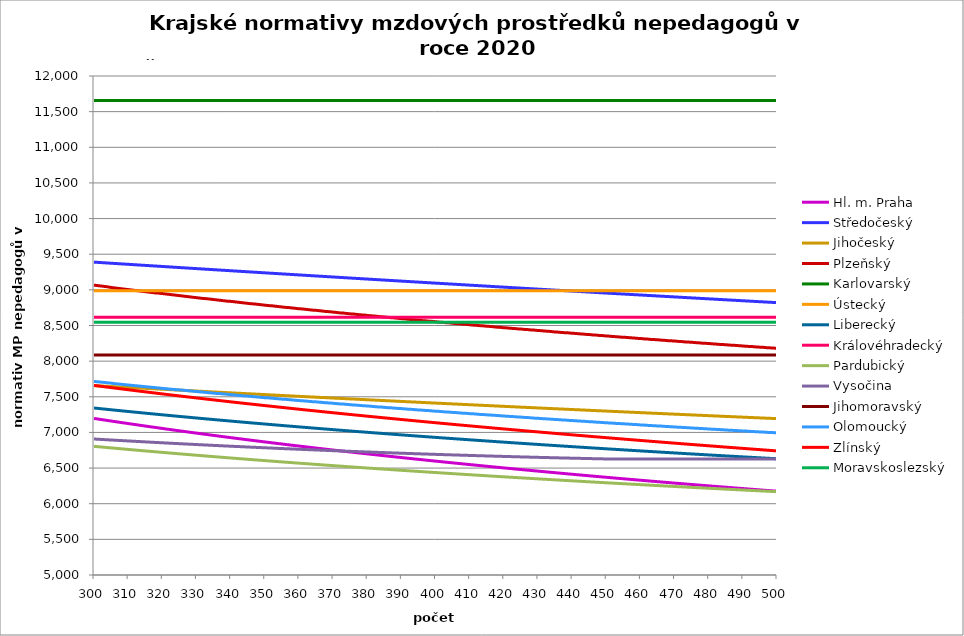
| Category | Hl. m. Praha | Středočeský | Jihočeský | Plzeňský | Karlovarský  | Ústecký   | Liberecký | Královéhradecký | Pardubický | Vysočina | Jihomoravský | Olomoucký | Zlínský | Moravskoslezský |
|---|---|---|---|---|---|---|---|---|---|---|---|---|---|---|
| 300.0 | 7196.467 | 9388.86 | 7657.202 | 9066.271 | 11657.998 | 8987.069 | 7342.544 | 8617.204 | 6804.909 | 6907.685 | 8087.211 | 7715.459 | 7659.58 | 8545.876 |
| 301.0 | 7189.126 | 9385.801 | 7654.599 | 9060.297 | 11657.998 | 8987.069 | 7337.594 | 8617.204 | 6800.501 | 6904.929 | 8087.211 | 7710.662 | 7653.41 | 8545.876 |
| 302.0 | 7181.82 | 9382.743 | 7651.998 | 9054.33 | 11657.998 | 8987.069 | 7332.664 | 8617.204 | 6796.111 | 6902.176 | 8087.211 | 7705.871 | 7647.263 | 8545.876 |
| 303.0 | 7174.548 | 9379.689 | 7649.401 | 9048.371 | 11657.998 | 8987.069 | 7327.755 | 8617.204 | 6791.74 | 6899.253 | 8087.211 | 7701.087 | 7641.14 | 8545.876 |
| 304.0 | 7167.311 | 9376.636 | 7646.807 | 9042.42 | 11657.998 | 8987.069 | 7322.867 | 8617.204 | 6787.386 | 6896.504 | 8087.211 | 7696.308 | 7635.04 | 8545.876 |
| 305.0 | 7160.107 | 9373.586 | 7644.217 | 9033.509 | 11657.998 | 8987.069 | 7317.999 | 8617.204 | 6783.051 | 6893.757 | 8087.211 | 7691.535 | 7628.963 | 8545.876 |
| 306.0 | 7152.937 | 9370.539 | 7641.629 | 9027.577 | 11657.998 | 8987.069 | 7313.152 | 8617.204 | 6778.734 | 6891.184 | 8087.211 | 7684.387 | 7622.908 | 8545.876 |
| 307.0 | 7145.801 | 9367.494 | 7639.044 | 9021.654 | 11657.998 | 8987.069 | 7308.326 | 8617.204 | 6774.435 | 6888.441 | 8087.211 | 7679.628 | 7616.876 | 8545.876 |
| 308.0 | 7138.698 | 9364.452 | 7636.463 | 9015.738 | 11657.998 | 8987.069 | 7303.519 | 8617.204 | 6770.154 | 6885.872 | 8087.211 | 7674.876 | 7610.867 | 8545.876 |
| 309.0 | 7131.627 | 9361.412 | 7633.885 | 9009.83 | 11657.998 | 8987.069 | 7298.732 | 8617.204 | 6765.89 | 6883.134 | 8087.211 | 7670.13 | 7604.88 | 8545.876 |
| 310.0 | 7124.589 | 9358.375 | 7631.309 | 9003.929 | 11657.998 | 8987.069 | 7293.965 | 8617.204 | 6761.643 | 6880.568 | 8087.211 | 7665.389 | 7598.916 | 8545.876 |
| 311.0 | 7117.584 | 9355.34 | 7628.737 | 8998.037 | 11657.998 | 8987.069 | 7289.218 | 8617.204 | 6757.414 | 6877.834 | 8087.211 | 7660.655 | 7592.973 | 8545.876 |
| 312.0 | 7110.61 | 9352.307 | 7626.168 | 8992.152 | 11657.998 | 8987.069 | 7284.49 | 8617.204 | 6753.202 | 6875.273 | 8087.211 | 7655.926 | 7587.052 | 8545.876 |
| 313.0 | 7103.669 | 9349.277 | 7623.602 | 8986.275 | 11657.998 | 8987.069 | 7279.781 | 8617.204 | 6749.007 | 6872.543 | 8087.211 | 7651.203 | 7581.152 | 8545.876 |
| 314.0 | 7096.758 | 9346.249 | 7621.039 | 8980.405 | 11657.998 | 8987.069 | 7275.092 | 8617.204 | 6744.828 | 6870.156 | 8087.211 | 7646.486 | 7575.274 | 8545.876 |
| 315.0 | 7089.879 | 9343.224 | 7618.48 | 8974.543 | 11657.998 | 8987.069 | 7270.422 | 8617.204 | 6740.667 | 6867.43 | 8087.211 | 7641.774 | 7569.418 | 8545.876 |
| 316.0 | 7083.031 | 9340.201 | 7615.923 | 8968.689 | 11657.998 | 8987.069 | 7265.77 | 8617.204 | 6736.522 | 6864.877 | 8087.211 | 7637.069 | 7563.582 | 8545.876 |
| 317.0 | 7076.214 | 9337.181 | 7613.369 | 8962.842 | 11657.998 | 8987.069 | 7261.138 | 8617.204 | 6732.394 | 6862.155 | 8087.211 | 7632.369 | 7557.768 | 8545.876 |
| 318.0 | 7069.427 | 9334.163 | 7610.819 | 8957.003 | 11657.998 | 8987.069 | 7256.524 | 8617.204 | 6728.282 | 6859.606 | 8087.211 | 7627.675 | 7551.975 | 8545.876 |
| 319.0 | 7062.671 | 9331.147 | 7608.271 | 8954.087 | 11657.998 | 8987.069 | 7251.928 | 8617.204 | 6724.186 | 6857.228 | 8087.211 | 7622.987 | 7546.202 | 8545.876 |
| 320.0 | 7055.944 | 9328.134 | 7605.727 | 8948.259 | 11657.998 | 8987.069 | 7247.351 | 8617.204 | 6720.107 | 6854.682 | 8087.211 | 7618.305 | 7540.45 | 8545.876 |
| 321.0 | 7049.247 | 9325.124 | 7603.185 | 8942.439 | 11657.998 | 8987.069 | 7242.792 | 8617.204 | 6716.043 | 6852.138 | 8087.211 | 7613.628 | 7534.718 | 8545.876 |
| 322.0 | 7042.58 | 9322.115 | 7600.647 | 8936.627 | 11657.998 | 8987.069 | 7238.251 | 8617.204 | 6711.996 | 6849.596 | 8087.211 | 7608.957 | 7529.006 | 8545.876 |
| 323.0 | 7035.942 | 9319.109 | 7598.112 | 8930.822 | 11657.998 | 8987.069 | 7233.728 | 8617.204 | 6707.964 | 6847.055 | 8087.211 | 7604.292 | 7523.315 | 8545.876 |
| 324.0 | 7029.333 | 9316.106 | 7595.58 | 8925.024 | 11657.998 | 8987.069 | 7229.223 | 8617.204 | 6703.948 | 6844.686 | 8087.211 | 7599.632 | 7517.644 | 8545.876 |
| 325.0 | 7022.753 | 9313.105 | 7593.05 | 8919.235 | 11657.998 | 8987.069 | 7224.736 | 8617.204 | 6699.947 | 6842.319 | 8087.211 | 7597.305 | 7511.992 | 8545.876 |
| 326.0 | 7016.201 | 9310.106 | 7590.524 | 8913.452 | 11657.998 | 8987.069 | 7220.266 | 8617.204 | 6695.962 | 6839.784 | 8087.211 | 7592.654 | 7506.36 | 8545.876 |
| 327.0 | 7009.678 | 9307.109 | 7588.001 | 8907.677 | 11657.998 | 8987.069 | 7215.813 | 8617.204 | 6691.993 | 6837.251 | 8087.211 | 7588.009 | 7500.748 | 8545.876 |
| 328.0 | 7003.183 | 9304.115 | 7585.481 | 8901.91 | 11657.998 | 8987.069 | 7211.378 | 8617.204 | 6688.038 | 6834.888 | 8087.211 | 7583.369 | 7495.155 | 8545.876 |
| 329.0 | 6996.716 | 9301.123 | 7582.964 | 8896.15 | 11657.998 | 8987.069 | 7206.96 | 8617.204 | 6684.099 | 6832.527 | 8087.211 | 7578.735 | 7489.582 | 8545.876 |
| 330.0 | 6990.277 | 9298.134 | 7580.45 | 8890.398 | 11657.998 | 8987.069 | 7202.559 | 8617.204 | 6680.174 | 6830 | 8087.211 | 7574.107 | 7484.027 | 8545.876 |
| 331.0 | 6983.865 | 9295.147 | 7577.939 | 8884.653 | 11657.998 | 8987.069 | 7198.175 | 8617.204 | 6676.265 | 6827.811 | 8087.211 | 7569.484 | 7478.492 | 8545.876 |
| 332.0 | 6977.48 | 9292.162 | 7575.431 | 8878.915 | 11657.998 | 8987.069 | 7193.807 | 8617.204 | 6672.37 | 6825.287 | 8087.211 | 7564.867 | 7472.976 | 8545.876 |
| 333.0 | 6971.123 | 9289.18 | 7572.926 | 8876.049 | 11657.998 | 8987.069 | 7189.457 | 8617.204 | 6668.49 | 6823.1 | 8087.211 | 7560.256 | 7467.478 | 8545.876 |
| 334.0 | 6964.792 | 9286.2 | 7570.424 | 8870.323 | 11657.998 | 8987.069 | 7185.123 | 8617.204 | 6664.625 | 6820.58 | 8087.211 | 7555.65 | 7461.999 | 8545.876 |
| 335.0 | 6958.488 | 9283.222 | 7567.925 | 8864.603 | 11657.998 | 8987.069 | 7180.805 | 8617.204 | 6660.774 | 6818.229 | 8087.211 | 7551.05 | 7456.539 | 8545.876 |
| 336.0 | 6952.211 | 9280.247 | 7565.429 | 8858.892 | 11657.998 | 8987.069 | 7176.504 | 8617.204 | 6656.937 | 6816.047 | 8087.211 | 7546.456 | 7451.097 | 8545.876 |
| 337.0 | 6945.959 | 9277.274 | 7562.935 | 8853.187 | 11657.998 | 8987.069 | 7172.219 | 8617.204 | 6653.115 | 6813.699 | 8087.211 | 7544.161 | 7445.673 | 8545.876 |
| 338.0 | 6939.734 | 9274.303 | 7560.445 | 8847.49 | 11657.998 | 8987.069 | 7167.95 | 8617.204 | 6649.307 | 6811.186 | 8087.211 | 7539.574 | 7440.267 | 8545.876 |
| 339.0 | 6933.535 | 9271.334 | 7557.958 | 8841.801 | 11657.998 | 8987.069 | 7163.697 | 8617.204 | 6645.513 | 6809.009 | 8087.211 | 7534.994 | 7434.88 | 8545.876 |
| 340.0 | 6927.361 | 9268.368 | 7555.474 | 8838.959 | 11657.998 | 8987.069 | 7159.459 | 8617.204 | 6641.733 | 6806.666 | 8087.211 | 7530.419 | 7429.51 | 8545.876 |
| 341.0 | 6921.213 | 9265.404 | 7552.993 | 8833.28 | 11657.998 | 8987.069 | 7155.238 | 8617.204 | 6637.967 | 6804.492 | 8087.211 | 7525.85 | 7424.158 | 8545.876 |
| 342.0 | 6915.09 | 9262.443 | 7550.515 | 8827.608 | 11657.998 | 8987.069 | 7151.032 | 8617.204 | 6634.214 | 6802.152 | 8087.211 | 7521.286 | 7418.824 | 8545.876 |
| 343.0 | 6908.992 | 9259.483 | 7548.039 | 8821.944 | 11657.998 | 8987.069 | 7146.842 | 8617.204 | 6630.476 | 6800.147 | 8087.211 | 7516.727 | 7413.507 | 8545.876 |
| 344.0 | 6902.919 | 9256.526 | 7545.567 | 8816.287 | 11657.998 | 8987.069 | 7142.667 | 8617.204 | 6626.751 | 6797.81 | 8087.211 | 7512.174 | 7408.208 | 8545.876 |
| 345.0 | 6896.871 | 9253.572 | 7543.098 | 8810.638 | 11657.998 | 8987.069 | 7138.508 | 8617.204 | 6623.039 | 6795.642 | 8087.211 | 7509.9 | 7402.926 | 8545.876 |
| 346.0 | 6890.847 | 9250.619 | 7540.631 | 8804.995 | 11657.998 | 8987.069 | 7134.364 | 8617.204 | 6619.341 | 6793.308 | 8087.211 | 7505.356 | 7397.661 | 8545.876 |
| 347.0 | 6884.847 | 9247.669 | 7538.168 | 8802.177 | 11657.998 | 8987.069 | 7130.234 | 8617.204 | 6615.656 | 6791.309 | 8087.211 | 7500.816 | 7392.413 | 8545.876 |
| 348.0 | 6878.872 | 9244.721 | 7535.707 | 8796.545 | 11657.998 | 8987.069 | 7126.12 | 8617.204 | 6611.985 | 6788.978 | 8087.211 | 7496.283 | 7387.182 | 8545.876 |
| 349.0 | 6872.921 | 9241.775 | 7533.25 | 8790.921 | 11657.998 | 8987.069 | 7122.021 | 8617.204 | 6608.326 | 6786.982 | 8087.211 | 7491.755 | 7381.968 | 8545.876 |
| 350.0 | 6866.994 | 9238.832 | 7530.795 | 8785.304 | 11657.998 | 8987.069 | 7117.937 | 8617.204 | 6604.681 | 6784.654 | 8087.211 | 7487.232 | 7376.771 | 8545.876 |
| 351.0 | 6861.09 | 9235.89 | 7528.343 | 8779.693 | 11657.998 | 8987.069 | 7113.867 | 8617.204 | 6601.049 | 6782.66 | 8087.211 | 7484.973 | 7371.591 | 8545.876 |
| 352.0 | 6855.209 | 9232.951 | 7525.895 | 8776.891 | 11657.998 | 8987.069 | 7109.812 | 8617.204 | 6597.429 | 6780.501 | 8087.211 | 7480.458 | 7366.427 | 8545.876 |
| 353.0 | 6849.352 | 9230.015 | 7523.449 | 8771.292 | 11657.998 | 8987.069 | 7105.771 | 8617.204 | 6593.822 | 6778.343 | 8087.211 | 7475.949 | 7361.279 | 8545.876 |
| 354.0 | 6843.519 | 9227.08 | 7521.006 | 8765.7 | 11657.998 | 8987.069 | 7101.745 | 8617.204 | 6590.228 | 6776.187 | 8087.211 | 7471.446 | 7356.148 | 8545.876 |
| 355.0 | 6837.708 | 9224.148 | 7518.566 | 8760.115 | 11657.998 | 8987.069 | 7097.733 | 8617.204 | 6586.647 | 6774.198 | 8087.211 | 7466.948 | 7351.033 | 8545.876 |
| 356.0 | 6831.92 | 9221.218 | 7516.128 | 8754.537 | 11657.998 | 8987.069 | 7093.736 | 8617.204 | 6583.078 | 6772.045 | 8087.211 | 7464.701 | 7345.934 | 8545.876 |
| 357.0 | 6826.154 | 9218.29 | 7513.694 | 8751.75 | 11657.998 | 8987.069 | 7089.752 | 8617.204 | 6579.522 | 6770.058 | 8087.211 | 7460.211 | 7340.851 | 8545.876 |
| 358.0 | 6820.411 | 9215.364 | 7511.263 | 8746.183 | 11657.998 | 8987.069 | 7085.783 | 8617.204 | 6575.978 | 6768.073 | 8087.211 | 7455.726 | 7335.784 | 8545.876 |
| 359.0 | 6814.69 | 9212.441 | 7508.834 | 8740.623 | 11657.998 | 8987.069 | 7081.827 | 8617.204 | 6572.446 | 6765.923 | 8087.211 | 7451.247 | 7330.733 | 8545.876 |
| 360.0 | 6808.992 | 9209.52 | 7506.409 | 8735.07 | 11657.998 | 8987.069 | 7077.886 | 8617.204 | 6568.926 | 6763.94 | 8087.211 | 7446.773 | 7325.698 | 8545.876 |
| 361.0 | 6803.315 | 9206.601 | 7503.986 | 8732.296 | 11657.998 | 8987.069 | 7073.958 | 8617.204 | 6565.419 | 6761.793 | 8087.211 | 7444.538 | 7320.678 | 8545.876 |
| 362.0 | 6797.661 | 9203.684 | 7501.566 | 8726.753 | 11657.998 | 8987.069 | 7070.044 | 8617.204 | 6561.924 | 6759.813 | 8087.211 | 7440.072 | 7315.674 | 8545.876 |
| 363.0 | 6792.028 | 9200.769 | 7499.149 | 8721.218 | 11657.998 | 8987.069 | 7066.143 | 8617.204 | 6558.44 | 6757.998 | 8087.211 | 7435.612 | 7310.685 | 8545.876 |
| 364.0 | 6786.416 | 9197.857 | 7496.735 | 8715.689 | 11657.998 | 8987.069 | 7062.256 | 8617.204 | 6554.969 | 6755.855 | 8087.211 | 7431.156 | 7305.711 | 8545.876 |
| 365.0 | 6780.826 | 9194.947 | 7494.324 | 8712.928 | 11657.998 | 8987.069 | 7058.382 | 8617.204 | 6551.509 | 6753.878 | 8087.211 | 7428.931 | 7300.753 | 8545.876 |
| 366.0 | 6775.258 | 9192.039 | 7491.916 | 8707.41 | 11657.998 | 8987.069 | 7054.521 | 8617.204 | 6548.062 | 6751.902 | 8087.211 | 7424.484 | 7295.81 | 8545.876 |
| 367.0 | 6769.71 | 9189.133 | 7489.51 | 8701.899 | 11657.998 | 8987.069 | 7050.674 | 8617.204 | 6544.625 | 6749.927 | 8087.211 | 7420.042 | 7290.882 | 8545.876 |
| 368.0 | 6764.183 | 9186.229 | 7487.108 | 8696.395 | 11657.998 | 8987.069 | 7046.84 | 8617.204 | 6541.201 | 6748.118 | 8087.211 | 7415.605 | 7285.969 | 8545.876 |
| 369.0 | 6758.677 | 9183.328 | 7484.708 | 8693.645 | 11657.998 | 8987.069 | 7043.019 | 8617.204 | 6537.788 | 6746.145 | 8087.211 | 7413.389 | 7281.07 | 8545.876 |
| 370.0 | 6753.192 | 9180.428 | 7482.311 | 8688.152 | 11657.998 | 8987.069 | 7039.211 | 8617.204 | 6534.386 | 6744.174 | 8087.211 | 7408.961 | 7276.187 | 8545.876 |
| 371.0 | 6747.727 | 9177.531 | 7479.917 | 8682.665 | 11657.998 | 8987.069 | 7035.416 | 8617.204 | 6530.996 | 6742.367 | 8087.211 | 7404.537 | 7271.318 | 8545.876 |
| 372.0 | 6742.283 | 9174.636 | 7477.526 | 8677.185 | 11657.998 | 8987.069 | 7031.633 | 8617.204 | 6527.617 | 6740.398 | 8087.211 | 7400.119 | 7266.463 | 8545.876 |
| 373.0 | 6736.859 | 9171.743 | 7475.137 | 8674.448 | 11657.998 | 8987.069 | 7027.864 | 8617.204 | 6524.249 | 6738.594 | 8087.211 | 7397.912 | 7261.623 | 8545.876 |
| 374.0 | 6731.455 | 9168.852 | 7472.752 | 8668.979 | 11657.998 | 8987.069 | 7024.107 | 8617.204 | 6520.893 | 6736.791 | 8087.211 | 7393.502 | 7256.798 | 8545.876 |
| 375.0 | 6726.071 | 9165.963 | 7470.369 | 8663.516 | 11657.998 | 8987.069 | 7020.362 | 8617.204 | 6517.547 | 6734.825 | 8087.211 | 7389.097 | 7251.987 | 8545.876 |
| 376.0 | 6720.706 | 9163.077 | 7467.989 | 8660.787 | 11657.998 | 8987.069 | 7016.63 | 8617.204 | 6514.213 | 6733.024 | 8087.211 | 7384.698 | 7247.19 | 8545.876 |
| 377.0 | 6715.362 | 9160.193 | 7465.612 | 8655.335 | 11657.998 | 8987.069 | 7012.911 | 8617.204 | 6510.889 | 6731.224 | 8087.211 | 7382.5 | 7242.407 | 8545.876 |
| 378.0 | 6710.037 | 9157.31 | 7463.238 | 8649.89 | 11657.998 | 8987.069 | 7009.203 | 8617.204 | 6507.577 | 6729.424 | 8087.211 | 7378.108 | 7237.638 | 8545.876 |
| 379.0 | 6704.731 | 9154.43 | 7460.866 | 8647.17 | 11657.998 | 8987.069 | 7005.508 | 8617.204 | 6504.275 | 6727.463 | 8087.211 | 7373.722 | 7232.884 | 8545.876 |
| 380.0 | 6699.445 | 9151.552 | 7458.498 | 8641.735 | 11657.998 | 8987.069 | 7001.826 | 8617.204 | 6500.984 | 6725.829 | 8087.211 | 7371.53 | 7228.143 | 8545.876 |
| 381.0 | 6694.178 | 9148.676 | 7456.132 | 8636.307 | 11657.998 | 8987.069 | 6998.155 | 8617.204 | 6497.704 | 6724.032 | 8087.211 | 7367.152 | 7223.416 | 8545.876 |
| 382.0 | 6688.93 | 9145.803 | 7453.769 | 8633.595 | 11657.998 | 8987.069 | 6994.496 | 8617.204 | 6494.434 | 6722.074 | 8087.211 | 7362.778 | 7218.703 | 8545.876 |
| 383.0 | 6683.701 | 9142.931 | 7451.409 | 8628.177 | 11657.998 | 8987.069 | 6990.85 | 8617.204 | 6491.175 | 6720.443 | 8087.211 | 7358.41 | 7214.003 | 8545.876 |
| 384.0 | 6678.49 | 9140.062 | 7449.051 | 8622.766 | 11657.998 | 8987.069 | 6987.215 | 8617.204 | 6487.926 | 6718.649 | 8087.211 | 7356.228 | 7209.317 | 8545.876 |
| 385.0 | 6673.299 | 9137.194 | 7446.697 | 8620.063 | 11657.998 | 8987.069 | 6983.592 | 8617.204 | 6484.688 | 6717.02 | 8087.211 | 7351.867 | 7204.644 | 8545.876 |
| 386.0 | 6668.126 | 9134.329 | 7444.345 | 8614.662 | 11657.998 | 8987.069 | 6979.98 | 8617.204 | 6481.46 | 6715.391 | 8087.211 | 7347.512 | 7199.985 | 8545.876 |
| 387.0 | 6662.971 | 9131.466 | 7441.996 | 8609.267 | 11657.998 | 8987.069 | 6976.381 | 8617.204 | 6478.242 | 6713.437 | 8087.211 | 7345.336 | 7195.339 | 8545.876 |
| 388.0 | 6657.835 | 9128.604 | 7439.649 | 8606.573 | 11657.998 | 8987.069 | 6972.793 | 8617.204 | 6475.035 | 6711.81 | 8087.211 | 7340.988 | 7190.707 | 8545.876 |
| 389.0 | 6652.717 | 9125.745 | 7437.306 | 8601.189 | 11657.998 | 8987.069 | 6969.216 | 8617.204 | 6471.838 | 6710.184 | 8087.211 | 7336.646 | 7186.087 | 8545.876 |
| 390.0 | 6647.616 | 9122.888 | 7434.965 | 8595.811 | 11657.998 | 8987.069 | 6965.651 | 8617.204 | 6468.651 | 6708.558 | 8087.211 | 7334.477 | 7181.481 | 8545.876 |
| 391.0 | 6642.534 | 9120.033 | 7432.627 | 8593.125 | 11657.998 | 8987.069 | 6962.097 | 8617.204 | 6465.474 | 6706.934 | 8087.211 | 7330.142 | 7176.888 | 8545.876 |
| 392.0 | 6637.47 | 9117.181 | 7430.292 | 8587.758 | 11657.998 | 8987.069 | 6958.555 | 8617.204 | 6462.307 | 6705.147 | 8087.211 | 7325.812 | 7172.307 | 8545.876 |
| 393.0 | 6632.423 | 9114.33 | 7427.959 | 8582.397 | 11657.998 | 8987.069 | 6955.024 | 8617.204 | 6459.15 | 6703.524 | 8087.211 | 7323.649 | 7167.74 | 8545.876 |
| 394.0 | 6627.394 | 9111.481 | 7425.63 | 8579.719 | 11657.998 | 8987.069 | 6951.504 | 8617.204 | 6456.002 | 6701.902 | 8087.211 | 7319.327 | 7163.185 | 8545.876 |
| 395.0 | 6622.383 | 9108.635 | 7423.303 | 8574.369 | 11657.998 | 8987.069 | 6947.995 | 8617.204 | 6452.865 | 6700.281 | 8087.211 | 7315.01 | 7158.643 | 8545.876 |
| 396.0 | 6617.389 | 9105.79 | 7420.978 | 8569.025 | 11657.998 | 8987.069 | 6944.497 | 8617.204 | 6449.737 | 6698.66 | 8087.211 | 7312.854 | 7154.114 | 8545.876 |
| 397.0 | 6612.412 | 9102.948 | 7418.657 | 8566.355 | 11657.998 | 8987.069 | 6941.01 | 8617.204 | 6446.619 | 6697.04 | 8087.211 | 7308.544 | 7149.597 | 8545.876 |
| 398.0 | 6607.452 | 9100.107 | 7416.338 | 8561.021 | 11657.998 | 8987.069 | 6937.534 | 8617.204 | 6443.511 | 6695.583 | 8087.211 | 7306.392 | 7145.093 | 8545.876 |
| 399.0 | 6602.51 | 9097.269 | 7414.022 | 8558.357 | 11657.998 | 8987.069 | 6934.069 | 8617.204 | 6440.412 | 6693.803 | 8087.211 | 7302.09 | 7140.601 | 8545.876 |
| 400.0 | 6597.584 | 9094.432 | 7411.709 | 8553.033 | 11657.998 | 8987.069 | 6930.615 | 8617.204 | 6437.323 | 6692.185 | 8087.211 | 7297.793 | 7136.122 | 8545.876 |
| 401.0 | 6592.675 | 9091.598 | 7409.398 | 8547.715 | 11657.998 | 8987.069 | 6927.171 | 8617.204 | 6434.243 | 6690.73 | 8087.211 | 7295.647 | 7131.655 | 8545.876 |
| 402.0 | 6587.783 | 9088.766 | 7407.091 | 8545.059 | 11657.998 | 8987.069 | 6923.738 | 8617.204 | 6431.173 | 6689.114 | 8087.211 | 7291.358 | 7127.2 | 8545.876 |
| 403.0 | 6582.907 | 9085.936 | 7404.786 | 8539.752 | 11657.998 | 8987.069 | 6920.316 | 8617.204 | 6428.112 | 6687.66 | 8087.211 | 7287.074 | 7122.758 | 8545.876 |
| 404.0 | 6578.048 | 9083.107 | 7402.483 | 8537.1 | 11657.998 | 8987.069 | 6916.904 | 8617.204 | 6425.06 | 6686.207 | 8087.211 | 7284.934 | 7118.327 | 8545.876 |
| 405.0 | 6573.206 | 9080.281 | 7400.184 | 8531.803 | 11657.998 | 8987.069 | 6913.503 | 8617.204 | 6422.018 | 6684.593 | 8087.211 | 7280.657 | 7113.908 | 8545.876 |
| 406.0 | 6568.38 | 9077.457 | 7397.887 | 8526.512 | 11657.998 | 8987.069 | 6910.112 | 8617.204 | 6418.985 | 6683.141 | 8087.211 | 7278.521 | 7109.502 | 8545.876 |
| 407.0 | 6563.57 | 9074.635 | 7395.592 | 8523.869 | 11657.998 | 8987.069 | 6906.731 | 8617.204 | 6415.961 | 6681.69 | 8087.211 | 7274.252 | 7105.107 | 8545.876 |
| 408.0 | 6558.776 | 9071.815 | 7393.301 | 8518.587 | 11657.998 | 8987.069 | 6903.361 | 8617.204 | 6412.946 | 6680.239 | 8087.211 | 7269.988 | 7100.724 | 8545.876 |
| 409.0 | 6553.998 | 9068.997 | 7391.012 | 8515.949 | 11657.998 | 8987.069 | 6900.001 | 8617.204 | 6409.94 | 6678.789 | 8087.211 | 7267.858 | 7096.353 | 8545.876 |
| 410.0 | 6549.236 | 9066.181 | 7388.726 | 8510.678 | 11657.998 | 8987.069 | 6896.651 | 8617.204 | 6406.943 | 6677.34 | 8087.211 | 7263.602 | 7091.994 | 8545.876 |
| 411.0 | 6544.49 | 9063.367 | 7386.442 | 8505.413 | 11657.998 | 8987.069 | 6893.311 | 8617.204 | 6403.955 | 6675.891 | 8087.211 | 7261.475 | 7087.646 | 8545.876 |
| 412.0 | 6539.759 | 9060.555 | 7384.162 | 8502.783 | 11657.998 | 8987.069 | 6889.982 | 8617.204 | 6400.976 | 6674.443 | 8087.211 | 7257.226 | 7083.31 | 8545.876 |
| 413.0 | 6535.045 | 9057.745 | 7381.884 | 8497.528 | 11657.998 | 8987.069 | 6886.662 | 8617.204 | 6398.005 | 6672.835 | 8087.211 | 7252.982 | 7078.985 | 8545.876 |
| 414.0 | 6530.345 | 9054.937 | 7379.608 | 8494.903 | 11657.998 | 8987.069 | 6883.352 | 8617.204 | 6395.044 | 6671.71 | 8087.211 | 7250.862 | 7074.672 | 8545.876 |
| 415.0 | 6525.661 | 9052.131 | 7377.335 | 8489.657 | 11657.998 | 8987.069 | 6880.052 | 8617.204 | 6392.091 | 6670.264 | 8087.211 | 7246.626 | 7070.37 | 8545.876 |
| 416.0 | 6520.993 | 9049.327 | 7375.065 | 8487.037 | 11657.998 | 8987.069 | 6876.762 | 8617.204 | 6389.147 | 6668.657 | 8087.211 | 7244.509 | 7066.08 | 8545.876 |
| 417.0 | 6516.34 | 9046.525 | 7372.798 | 8481.801 | 11657.998 | 8987.069 | 6873.482 | 8617.204 | 6386.212 | 6667.533 | 8087.211 | 7240.28 | 7061.801 | 8545.876 |
| 418.0 | 6511.702 | 9043.724 | 7370.533 | 8476.572 | 11657.998 | 8987.069 | 6870.211 | 8617.204 | 6383.285 | 6666.089 | 8087.211 | 7238.167 | 7057.533 | 8545.876 |
| 419.0 | 6507.079 | 9040.926 | 7368.271 | 8473.96 | 11657.998 | 8987.069 | 6866.95 | 8617.204 | 6380.367 | 6664.806 | 8087.211 | 7233.946 | 7053.276 | 8545.876 |
| 420.0 | 6502.47 | 9038.13 | 7366.012 | 8468.74 | 11657.998 | 8987.069 | 6863.699 | 8617.204 | 6377.457 | 6663.362 | 8087.211 | 7229.729 | 7049.03 | 8545.876 |
| 421.0 | 6497.877 | 9035.336 | 7363.755 | 8466.133 | 11657.998 | 8987.069 | 6860.457 | 8617.204 | 6374.556 | 6662.08 | 8087.211 | 7227.622 | 7044.795 | 8545.876 |
| 422.0 | 6493.299 | 9032.544 | 7361.501 | 8460.923 | 11657.998 | 8987.069 | 6857.225 | 8617.204 | 6371.663 | 6660.798 | 8087.211 | 7223.413 | 7040.572 | 8545.876 |
| 423.0 | 6488.735 | 9029.754 | 7359.25 | 8458.321 | 11657.998 | 8987.069 | 6854.002 | 8617.204 | 6368.778 | 6659.357 | 8087.211 | 7221.31 | 7036.359 | 8545.876 |
| 424.0 | 6484.186 | 9026.965 | 7357.001 | 8453.12 | 11657.998 | 8987.069 | 6850.788 | 8617.204 | 6365.902 | 6658.076 | 8087.211 | 7217.108 | 7032.157 | 8545.876 |
| 425.0 | 6479.652 | 9024.179 | 7354.755 | 8450.522 | 11657.998 | 8987.069 | 6847.584 | 8617.204 | 6363.034 | 6656.795 | 8087.211 | 7215.009 | 7027.966 | 8545.876 |
| 426.0 | 6475.132 | 9021.395 | 7352.511 | 8445.332 | 11657.998 | 8987.069 | 6844.389 | 8617.204 | 6360.174 | 6655.516 | 8087.211 | 7210.814 | 7023.785 | 8545.876 |
| 427.0 | 6470.626 | 9018.613 | 7350.27 | 8442.739 | 11657.998 | 8987.069 | 6841.204 | 8617.204 | 6357.322 | 6654.236 | 8087.211 | 7208.718 | 7019.615 | 8545.876 |
| 428.0 | 6466.135 | 9015.832 | 7348.032 | 8437.558 | 11657.998 | 8987.069 | 6838.027 | 8617.204 | 6354.479 | 6652.957 | 8087.211 | 7204.531 | 7015.456 | 8545.876 |
| 429.0 | 6461.657 | 9013.054 | 7345.796 | 8434.969 | 11657.998 | 8987.069 | 6834.86 | 8617.204 | 6351.643 | 6651.679 | 8087.211 | 7200.348 | 7011.307 | 8545.876 |
| 430.0 | 6457.194 | 9010.277 | 7343.563 | 8429.798 | 11657.998 | 8987.069 | 6831.702 | 8617.204 | 6348.816 | 6650.401 | 8087.211 | 7198.259 | 7007.169 | 8545.876 |
| 431.0 | 6452.745 | 9007.503 | 7341.333 | 8427.214 | 11657.998 | 8987.069 | 6828.553 | 8617.204 | 6345.997 | 6649.124 | 8087.211 | 7194.084 | 7003.042 | 8545.876 |
| 432.0 | 6448.31 | 9004.73 | 7339.105 | 8422.052 | 11657.998 | 8987.069 | 6825.413 | 8617.204 | 6343.185 | 6648.166 | 8087.211 | 7191.998 | 6998.925 | 8545.876 |
| 433.0 | 6443.889 | 9001.959 | 7336.88 | 8419.473 | 11657.998 | 8987.069 | 6822.281 | 8617.204 | 6340.382 | 6646.889 | 8087.211 | 7187.83 | 6994.818 | 8545.876 |
| 434.0 | 6439.481 | 8999.191 | 7334.658 | 8414.321 | 11657.998 | 8987.069 | 6819.159 | 8617.204 | 6337.586 | 6645.613 | 8087.211 | 7185.747 | 6990.721 | 8545.876 |
| 435.0 | 6435.088 | 8996.424 | 7332.438 | 8409.174 | 11657.998 | 8987.069 | 6816.046 | 8617.204 | 6334.798 | 6644.497 | 8087.211 | 7181.587 | 6986.635 | 8545.876 |
| 436.0 | 6430.708 | 8993.659 | 7330.22 | 8406.603 | 11657.998 | 8987.069 | 6812.941 | 8617.204 | 6332.018 | 6643.222 | 8087.211 | 7179.508 | 6982.559 | 8545.876 |
| 437.0 | 6426.341 | 8990.896 | 7328.006 | 8401.467 | 11657.998 | 8987.069 | 6809.845 | 8617.204 | 6329.246 | 6642.107 | 8087.211 | 7175.354 | 6978.493 | 8545.876 |
| 438.0 | 6421.988 | 8988.135 | 7325.793 | 8398.9 | 11657.998 | 8987.069 | 6806.758 | 8617.204 | 6326.481 | 6641.151 | 8087.211 | 7173.279 | 6974.437 | 8545.876 |
| 439.0 | 6417.648 | 8985.376 | 7323.584 | 8396.336 | 11657.998 | 8987.069 | 6803.679 | 8617.204 | 6323.724 | 6639.877 | 8087.211 | 7169.133 | 6970.391 | 8545.876 |
| 440.0 | 6413.322 | 8982.619 | 7321.377 | 8391.211 | 11657.998 | 8987.069 | 6800.609 | 8617.204 | 6320.975 | 6638.763 | 8087.211 | 7167.062 | 6966.355 | 8545.876 |
| 441.0 | 6409.009 | 8979.863 | 7319.173 | 8388.652 | 11657.998 | 8987.069 | 6797.548 | 8617.204 | 6318.233 | 6637.649 | 8087.211 | 7162.922 | 6962.329 | 8545.876 |
| 442.0 | 6404.709 | 8977.11 | 7316.971 | 8383.537 | 11657.998 | 8987.069 | 6794.495 | 8617.204 | 6315.499 | 6636.536 | 8087.211 | 7160.855 | 6958.313 | 8545.876 |
| 443.0 | 6400.422 | 8974.359 | 7314.772 | 8380.981 | 11657.998 | 8987.069 | 6791.451 | 8617.204 | 6312.772 | 6635.582 | 8087.211 | 7156.722 | 6954.307 | 8545.876 |
| 444.0 | 6396.148 | 8971.609 | 7312.575 | 8375.876 | 11657.998 | 8987.069 | 6788.415 | 8617.204 | 6310.053 | 6634.469 | 8087.211 | 7154.658 | 6950.311 | 8545.876 |
| 445.0 | 6391.887 | 8968.861 | 7310.381 | 8373.325 | 11657.998 | 8987.069 | 6785.387 | 8617.204 | 6307.341 | 6633.356 | 8087.211 | 7150.533 | 6946.324 | 8545.876 |
| 446.0 | 6387.639 | 8966.116 | 7308.189 | 8368.229 | 11657.998 | 8987.069 | 6782.368 | 8617.204 | 6304.637 | 6632.244 | 8087.211 | 7148.473 | 6942.347 | 8545.876 |
| 447.0 | 6383.404 | 8963.372 | 7306 | 8365.683 | 11657.998 | 8987.069 | 6779.357 | 8617.204 | 6301.94 | 6631.133 | 8087.211 | 7144.355 | 6938.38 | 8545.876 |
| 448.0 | 6379.181 | 8960.63 | 7303.814 | 8360.596 | 11657.998 | 8987.069 | 6776.354 | 8617.204 | 6299.25 | 6630.18 | 8087.211 | 7142.298 | 6934.422 | 8545.876 |
| 449.0 | 6374.971 | 8957.89 | 7301.63 | 8358.055 | 11657.998 | 8987.069 | 6773.359 | 8617.204 | 6296.567 | 6629.069 | 8087.211 | 7138.187 | 6930.474 | 8545.876 |
| 450.0 | 6370.774 | 8955.151 | 7299.449 | 8352.977 | 11657.998 | 8987.069 | 6770.373 | 8617.204 | 6293.892 | 6628.117 | 8087.211 | 7136.133 | 6926.535 | 8545.876 |
| 451.0 | 6366.589 | 8952.415 | 7297.27 | 8350.44 | 11657.998 | 8987.069 | 6767.395 | 8617.204 | 6291.224 | 6628.117 | 8087.211 | 7132.03 | 6922.606 | 8545.876 |
| 452.0 | 6362.417 | 8949.681 | 7295.094 | 8345.372 | 11657.998 | 8987.069 | 6764.425 | 8617.204 | 6288.563 | 6628.117 | 8087.211 | 7129.98 | 6918.686 | 8545.876 |
| 453.0 | 6358.257 | 8946.948 | 7292.92 | 8342.84 | 11657.998 | 8987.069 | 6761.462 | 8617.204 | 6285.909 | 6628.117 | 8087.211 | 7125.883 | 6914.775 | 8545.876 |
| 454.0 | 6354.11 | 8944.218 | 7290.749 | 8337.78 | 11657.998 | 8987.069 | 6758.508 | 8617.204 | 6283.262 | 6628.117 | 8087.211 | 7123.837 | 6910.874 | 8545.876 |
| 455.0 | 6349.974 | 8941.489 | 7288.581 | 8335.253 | 11657.998 | 8987.069 | 6755.562 | 8617.204 | 6280.622 | 6628.117 | 8087.211 | 7121.792 | 6906.982 | 8545.876 |
| 456.0 | 6345.851 | 8938.762 | 7286.415 | 8332.727 | 11657.998 | 8987.069 | 6752.624 | 8617.204 | 6277.99 | 6628.117 | 8087.211 | 7117.704 | 6903.1 | 8545.876 |
| 457.0 | 6341.74 | 8936.037 | 7284.251 | 8327.68 | 11657.998 | 8987.069 | 6749.693 | 8617.204 | 6275.364 | 6628.117 | 8087.211 | 7115.663 | 6899.226 | 8545.876 |
| 458.0 | 6337.641 | 8933.314 | 7282.09 | 8325.159 | 11657.998 | 8987.069 | 6746.771 | 8617.204 | 6272.745 | 6628.117 | 8087.211 | 7111.583 | 6895.362 | 8545.876 |
| 459.0 | 6333.554 | 8930.592 | 7279.932 | 8320.121 | 11657.998 | 8987.069 | 6743.856 | 8617.204 | 6270.133 | 6628.117 | 8087.211 | 7109.544 | 6891.506 | 8545.876 |
| 460.0 | 6329.479 | 8927.873 | 7277.776 | 8317.604 | 11657.998 | 8987.069 | 6740.949 | 8617.204 | 6267.528 | 6628.117 | 8087.211 | 7105.471 | 6887.66 | 8545.876 |
| 461.0 | 6325.416 | 8925.155 | 7275.622 | 8312.576 | 11657.998 | 8987.069 | 6738.05 | 8617.204 | 6264.93 | 6628.117 | 8087.211 | 7103.436 | 6883.823 | 8545.876 |
| 462.0 | 6321.364 | 8922.439 | 7273.472 | 8310.063 | 11657.998 | 8987.069 | 6735.158 | 8617.204 | 6262.338 | 6628.117 | 8087.211 | 7099.37 | 6879.995 | 8545.876 |
| 463.0 | 6317.324 | 8919.725 | 7271.323 | 8305.044 | 11657.998 | 8987.069 | 6732.274 | 8617.204 | 6259.754 | 6628.117 | 8087.211 | 7097.339 | 6876.175 | 8545.876 |
| 464.0 | 6313.296 | 8917.013 | 7269.177 | 8302.536 | 11657.998 | 8987.069 | 6729.398 | 8617.204 | 6257.176 | 6628.117 | 8087.211 | 7093.28 | 6872.365 | 8545.876 |
| 465.0 | 6309.28 | 8914.303 | 7267.034 | 8300.03 | 11657.998 | 8987.069 | 6726.529 | 8617.204 | 6254.604 | 6628.117 | 8087.211 | 7091.252 | 6868.563 | 8545.876 |
| 466.0 | 6305.275 | 8911.595 | 7264.893 | 8295.023 | 11657.998 | 8987.069 | 6723.667 | 8617.204 | 6252.04 | 6628.117 | 8087.211 | 7089.225 | 6864.77 | 8545.876 |
| 467.0 | 6301.281 | 8908.888 | 7262.755 | 8292.521 | 11657.998 | 8987.069 | 6720.814 | 8617.204 | 6249.482 | 6628.117 | 8087.211 | 7085.176 | 6860.986 | 8545.876 |
| 468.0 | 6297.299 | 8906.184 | 7260.619 | 8287.523 | 11657.998 | 8987.069 | 6717.967 | 8617.204 | 6246.93 | 6628.117 | 8087.211 | 7083.152 | 6857.211 | 8545.876 |
| 469.0 | 6293.328 | 8903.481 | 7258.485 | 8285.026 | 11657.998 | 8987.069 | 6715.128 | 8617.204 | 6244.386 | 6628.117 | 8087.211 | 7079.11 | 6853.444 | 8545.876 |
| 470.0 | 6289.369 | 8900.78 | 7256.354 | 8282.53 | 11657.998 | 8987.069 | 6712.297 | 8617.204 | 6241.847 | 6628.117 | 8087.211 | 7077.09 | 6849.686 | 8545.876 |
| 471.0 | 6285.421 | 8898.081 | 7254.226 | 8277.544 | 11657.998 | 8987.069 | 6709.472 | 8617.204 | 6239.316 | 6628.117 | 8087.211 | 7073.054 | 6845.936 | 8545.876 |
| 472.0 | 6281.483 | 8895.383 | 7252.1 | 8275.053 | 11657.998 | 8987.069 | 6706.655 | 8617.204 | 6236.79 | 6628.117 | 8087.211 | 7071.038 | 6842.195 | 8545.876 |
| 473.0 | 6277.558 | 8892.688 | 7249.977 | 8270.075 | 11657.998 | 8987.069 | 6703.845 | 8617.204 | 6234.271 | 6628.117 | 8087.211 | 7069.023 | 6838.463 | 8545.876 |
| 474.0 | 6273.643 | 8889.994 | 7247.856 | 8267.589 | 11657.998 | 8987.069 | 6701.043 | 8617.204 | 6231.759 | 6628.117 | 8087.211 | 7064.996 | 6834.739 | 8545.876 |
| 475.0 | 6269.739 | 8887.302 | 7245.737 | 8265.104 | 11657.998 | 8987.069 | 6698.248 | 8617.204 | 6229.253 | 6628.117 | 8087.211 | 7062.984 | 6831.023 | 8545.876 |
| 476.0 | 6265.846 | 8884.612 | 7243.621 | 8260.138 | 11657.998 | 8987.069 | 6695.459 | 8617.204 | 6226.753 | 6628.117 | 8087.211 | 7058.964 | 6827.316 | 8545.876 |
| 477.0 | 6261.964 | 8881.924 | 7241.507 | 8257.658 | 11657.998 | 8987.069 | 6692.678 | 8617.204 | 6224.259 | 6628.117 | 8087.211 | 7056.956 | 6823.617 | 8545.876 |
| 478.0 | 6258.092 | 8879.237 | 7239.396 | 8252.701 | 11657.998 | 8987.069 | 6689.904 | 8617.204 | 6221.772 | 6628.117 | 8087.211 | 7054.949 | 6819.926 | 8545.876 |
| 479.0 | 6254.232 | 8876.553 | 7237.288 | 8250.225 | 11657.998 | 8987.069 | 6687.137 | 8617.204 | 6219.291 | 6628.117 | 8087.211 | 7050.938 | 6816.244 | 8545.876 |
| 480.0 | 6250.382 | 8873.87 | 7235.181 | 8247.75 | 11657.998 | 8987.069 | 6684.377 | 8617.204 | 6216.816 | 6628.117 | 8087.211 | 7048.934 | 6812.57 | 8545.876 |
| 481.0 | 6246.543 | 8871.189 | 7233.078 | 8242.806 | 11657.998 | 8987.069 | 6681.625 | 8617.204 | 6214.348 | 6628.117 | 8087.211 | 7044.93 | 6808.904 | 8545.876 |
| 482.0 | 6242.714 | 8868.509 | 7230.976 | 8240.336 | 11657.998 | 8987.069 | 6678.879 | 8617.204 | 6211.885 | 6628.117 | 8087.211 | 7042.93 | 6805.246 | 8545.876 |
| 483.0 | 6238.896 | 8865.832 | 7228.877 | 8235.4 | 11657.998 | 8987.069 | 6676.139 | 8617.204 | 6209.429 | 6628.117 | 8087.211 | 7040.931 | 6801.597 | 8545.876 |
| 484.0 | 6235.089 | 8863.156 | 7226.781 | 8232.934 | 11657.998 | 8987.069 | 6673.407 | 8617.204 | 6206.979 | 6628.117 | 8087.211 | 7036.936 | 6797.955 | 8545.876 |
| 485.0 | 6231.292 | 8860.482 | 7224.687 | 8230.47 | 11657.998 | 8987.069 | 6670.682 | 8617.204 | 6204.535 | 6628.117 | 8087.211 | 7034.94 | 6794.322 | 8545.876 |
| 486.0 | 6227.505 | 8857.81 | 7222.595 | 8225.546 | 11657.998 | 8987.069 | 6667.963 | 8617.204 | 6202.097 | 6628.117 | 8087.211 | 7030.952 | 6790.696 | 8545.876 |
| 487.0 | 6223.729 | 8855.14 | 7220.506 | 8223.086 | 11657.998 | 8987.069 | 6665.252 | 8617.204 | 6199.665 | 6628.117 | 8087.211 | 7028.96 | 6787.079 | 8545.876 |
| 488.0 | 6219.963 | 8852.472 | 7218.42 | 8220.628 | 11657.998 | 8987.069 | 6662.547 | 8617.204 | 6197.239 | 6628.117 | 8087.211 | 7026.969 | 6783.469 | 8545.876 |
| 489.0 | 6216.207 | 8849.805 | 7216.335 | 8215.716 | 11657.998 | 8987.069 | 6659.848 | 8617.204 | 6194.819 | 6628.117 | 8087.211 | 7022.99 | 6779.867 | 8545.876 |
| 490.0 | 6212.461 | 8847.14 | 7214.253 | 8213.262 | 11657.998 | 8987.069 | 6657.157 | 8617.204 | 6192.404 | 6628.117 | 8087.211 | 7021.002 | 6776.274 | 8545.876 |
| 491.0 | 6208.725 | 8844.477 | 7212.174 | 8208.358 | 11657.998 | 8987.069 | 6654.472 | 8617.204 | 6189.996 | 6628.117 | 8087.211 | 7019.015 | 6772.688 | 8545.876 |
| 492.0 | 6205 | 8841.815 | 7210.097 | 8205.909 | 11657.998 | 8987.069 | 6651.793 | 8617.204 | 6187.594 | 6628.117 | 8087.211 | 7015.045 | 6769.109 | 8545.876 |
| 493.0 | 6201.285 | 8839.156 | 7208.022 | 8203.461 | 11657.998 | 8987.069 | 6649.122 | 8617.204 | 6185.197 | 6628.117 | 8087.211 | 7013.062 | 6765.539 | 8545.876 |
| 494.0 | 6197.579 | 8836.498 | 7205.95 | 8198.569 | 11657.998 | 8987.069 | 6646.456 | 8617.204 | 6182.806 | 6628.117 | 8087.211 | 7009.099 | 6761.976 | 8545.876 |
| 495.0 | 6193.883 | 8833.842 | 7203.88 | 8196.125 | 11657.998 | 8987.069 | 6643.798 | 8617.204 | 6180.421 | 6628.117 | 8087.211 | 7007.119 | 6758.421 | 8545.876 |
| 496.0 | 6190.198 | 8831.188 | 7201.813 | 8193.683 | 11657.998 | 8987.069 | 6641.145 | 8617.204 | 6178.042 | 6628.117 | 8087.211 | 7005.14 | 6754.874 | 8545.876 |
| 497.0 | 6186.522 | 8828.535 | 7199.748 | 8188.803 | 11657.998 | 8987.069 | 6638.5 | 8617.204 | 6175.668 | 6628.117 | 8087.211 | 7001.185 | 6751.334 | 8545.876 |
| 498.0 | 6182.856 | 8825.884 | 7197.685 | 8186.365 | 11657.998 | 8987.069 | 6635.86 | 8617.204 | 6173.301 | 6628.117 | 8087.211 | 6999.21 | 6747.802 | 8545.876 |
| 499.0 | 6179.199 | 8823.235 | 7195.625 | 8183.929 | 11657.998 | 8987.069 | 6633.228 | 8617.204 | 6170.938 | 6628.117 | 8087.211 | 6997.236 | 6744.277 | 8545.876 |
| 500.0 | 6175.553 | 8820.588 | 7193.567 | 8179.06 | 11657.998 | 8987.069 | 6630.601 | 8617.204 | 6168.582 | 6628.117 | 8087.211 | 6993.29 | 6740.76 | 8545.876 |